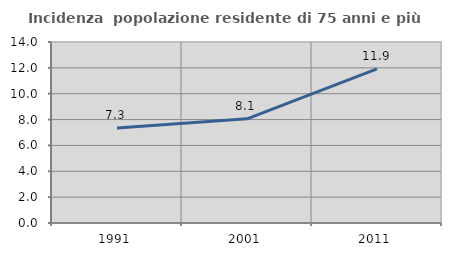
| Category | Incidenza  popolazione residente di 75 anni e più |
|---|---|
| 1991.0 | 7.349 |
| 2001.0 | 8.058 |
| 2011.0 | 11.926 |